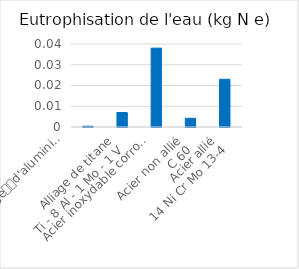
| Category | Series 0 |
|---|---|
| Alliage
d'aluminium
4032-T6
(Al Si 12,5 Mg Cu Ni) | 0 |
| Alliage de titane
Ti - 8 Al - 1 Mo - 1 V | 0.007 |
| Acier inoxydable corroyé
X6 Cr Ni Ti 18-10 | 0.038 |
| Acier non allié
C 60 | 0.004 |
| Acier allié
14 Ni Cr Mo 13-4 | 0.023 |